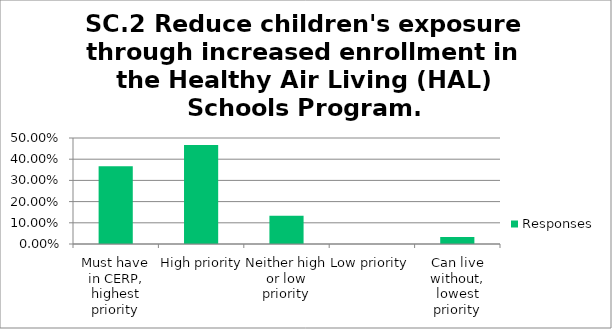
| Category | Responses |
|---|---|
| Must have in CERP, highest priority | 0.367 |
| High priority | 0.467 |
| Neither high or low priority | 0.133 |
| Low priority | 0 |
| Can live without, lowest priority | 0.033 |